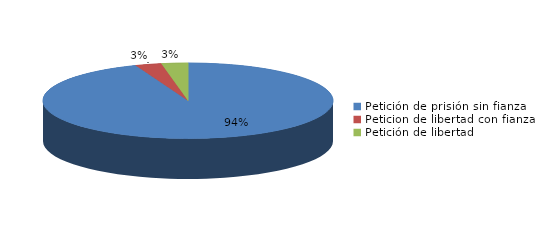
| Category | Series 0 |
|---|---|
| Petición de prisión sin fianza | 32 |
| Peticion de libertad con fianza | 1 |
| Petición de libertad | 1 |